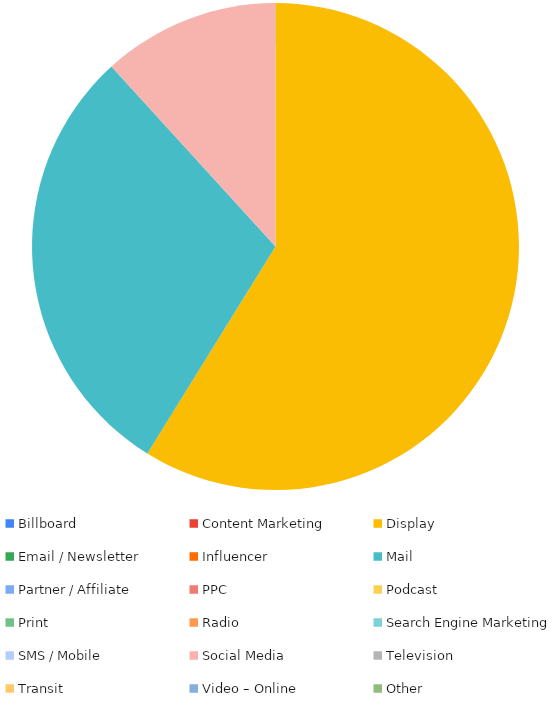
| Category | Series 0 |
|---|---|
| Billboard | 0 |
| Content Marketing | 0 |
| Display | 500 |
| Email / Newsletter | 0 |
| Influencer | 0 |
| Mail | 250 |
| Partner / Affiliate | 0 |
| PPC | 0 |
| Podcast | 0 |
| Print | 0 |
| Radio | 0 |
| Search Engine Marketing | 0 |
| SMS / Mobile | 0 |
| Social Media | 100 |
| Television | 0 |
| Transit | 0 |
| Video – Online | 0 |
| Other | 0 |